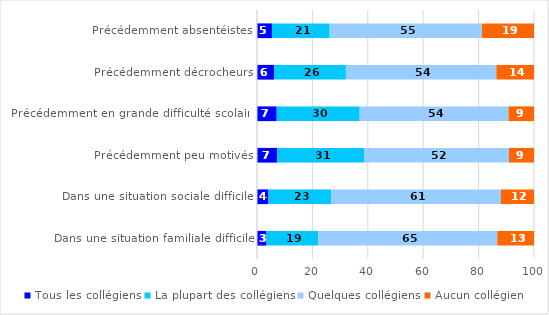
| Category | Tous les collégiens | La plupart des collégiens | Quelques collégiens | Aucun collégien |
|---|---|---|---|---|
| Précédemment absentéistes | 5.394 | 20.832 | 54.959 | 18.815 |
| Précédemment décrocheurs | 6.156 | 25.938 | 54.303 | 13.602 |
| Précédemment en grande difficulté scolaire | 7.113 | 29.96 | 53.705 | 9.222 |
| Précédemment peu motivés | 7.301 | 31.394 | 52.288 | 9.016 |
| Dans une situation sociale difficile | 4.136 | 22.629 | 61.303 | 11.932 |
| Dans une situation familiale difficile | 3.403 | 18.749 | 64.578 | 13.27 |